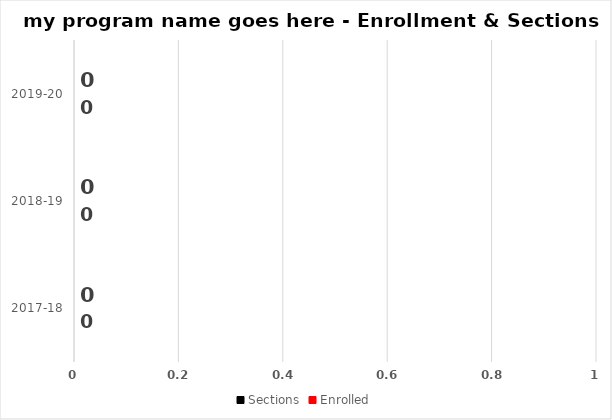
| Category | Sections | Enrolled |
|---|---|---|
| 2017-18 | 0 | 0 |
| 2018-19 | 0 | 0 |
| 2019-20 | 0 | 0 |